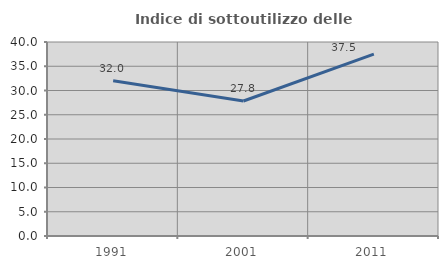
| Category | Indice di sottoutilizzo delle abitazioni  |
|---|---|
| 1991.0 | 32.002 |
| 2001.0 | 27.833 |
| 2011.0 | 37.508 |